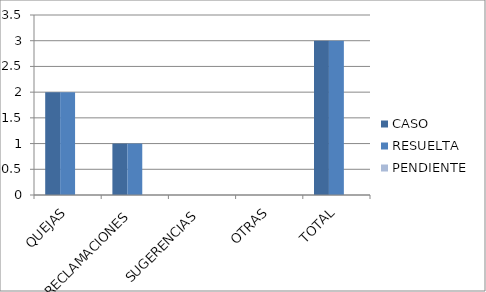
| Category | CASO | RESUELTA | PENDIENTE |
|---|---|---|---|
| QUEJAS | 2 | 2 | 0 |
| RECLAMACIONES | 1 | 1 | 0 |
| SUGERENCIAS | 0 | 0 | 0 |
| OTRAS | 0 | 0 | 0 |
| TOTAL | 3 | 3 | 0 |